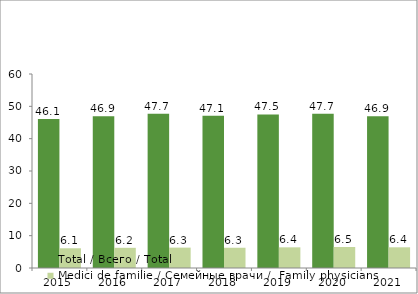
| Category | Total / Всего / Total | Medici de familie / Семейные врачи /  Family physicians |
|---|---|---|
| 2015.0 | 46.1 | 6.1 |
| 2016.0 | 46.9 | 6.241 |
| 2017.0 | 47.7 | 6.307 |
| 2018.0 | 47.1 | 6.262 |
| 2019.0 | 47.5 | 6.389 |
| 2020.0 | 47.7 | 6.5 |
| 2021.0 | 46.9 | 6.4 |